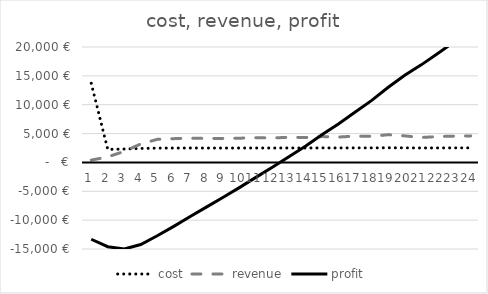
| Category | cost | revenue | profit |
|---|---|---|---|
| 0 | 13710 | 400 | -13310 |
| 1 | 2252 | 960 | -14602 |
| 2 | 2324 | 1920 | -15006 |
| 3 | 2420 | 3200 | -14226 |
| 4 | 2480 | 4000 | -12706 |
| 5 | 2489 | 4120 | -11075 |
| 6 | 2495 | 4200 | -9370 |
| 7 | 2492 | 4160 | -7702 |
| 8 | 2492 | 4160 | -6034 |
| 9 | 2495 | 4200 | -4329 |
| 10 | 2501 | 4280 | -2550 |
| 11 | 2498 | 4240 | -808 |
| 12 | 2507 | 4360 | 1045 |
| 13 | 2504 | 4320 | 2861 |
| 14 | 2516 | 4480 | 4825 |
| 15 | 2510 | 4400 | 6715 |
| 16 | 2522 | 4560 | 8753 |
| 17 | 2519 | 4520 | 10754 |
| 18 | 2540 | 4800 | 13014 |
| 19 | 2525 | 4600 | 15089 |
| 20 | 2504 | 4320 | 16905 |
| 21 | 2516 | 4480 | 18869 |
| 22 | 2522 | 4560 | 20907 |
| 23 | 2525 | 4600 | 22982 |